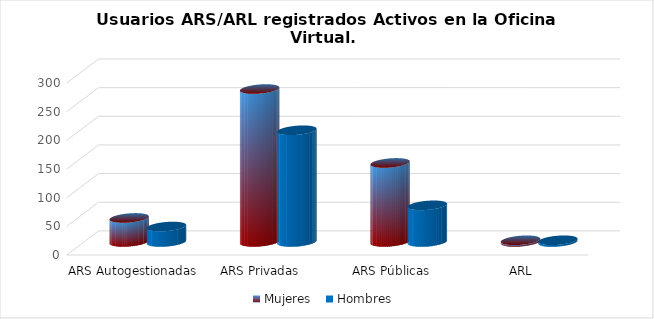
| Category | Mujeres | Hombres |
|---|---|---|
| ARS Autogestionadas | 42 | 27 |
| ARS Privadas | 267 | 195 |
| ARS Públicas | 138 | 64 |
| ARL | 3 | 3 |